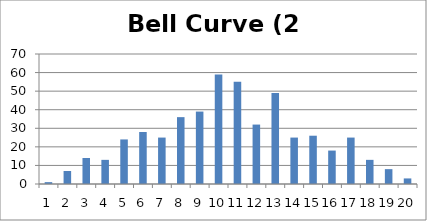
| Category | Bell Curve (2 dice) |
|---|---|
| 0 | 1 |
| 1 | 7 |
| 2 | 14 |
| 3 | 13 |
| 4 | 24 |
| 5 | 28 |
| 6 | 25 |
| 7 | 36 |
| 8 | 39 |
| 9 | 59 |
| 10 | 55 |
| 11 | 32 |
| 12 | 49 |
| 13 | 25 |
| 14 | 26 |
| 15 | 18 |
| 16 | 25 |
| 17 | 13 |
| 18 | 8 |
| 19 | 3 |